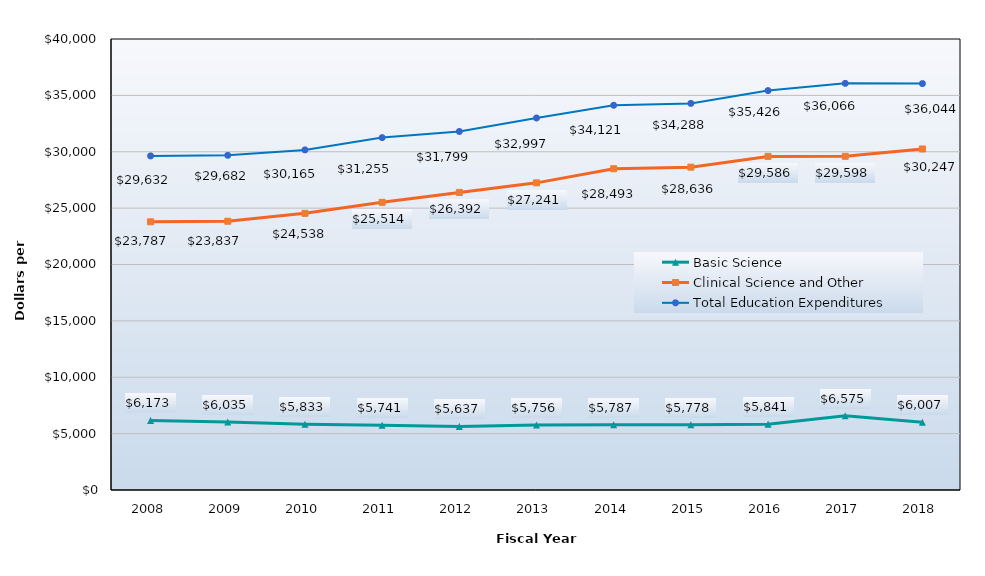
| Category | Basic Science | Clinical Science and Other | Total Education Expenditures |
|---|---|---|---|
| 2008.0 | 6173 | 23787 | 29632 |
| 2009.0 | 6035 | 23837 | 29682 |
| 2010.0 | 5833 | 24538 | 30165 |
| 2011.0 | 5741 | 25514 | 31255 |
| 2012.0 | 5637 | 26392 | 31799 |
| 2013.0 | 5756 | 27241 | 32997 |
| 2014.0 | 5787 | 28493 | 34121 |
| 2015.0 | 5778 | 28636 | 34288 |
| 2016.0 | 5841 | 29586 | 35426 |
| 2017.0 | 6575 | 29598 | 36066 |
| 2018.0 | 6007 | 30247 | 36044 |